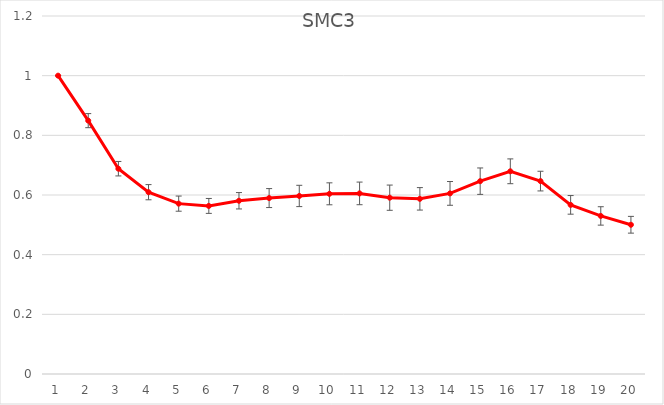
| Category | SMC3 |
|---|---|
| 0 | 1 |
| 1 | 0.849 |
| 2 | 0.688 |
| 3 | 0.609 |
| 4 | 0.571 |
| 5 | 0.563 |
| 6 | 0.581 |
| 7 | 0.59 |
| 8 | 0.597 |
| 9 | 0.604 |
| 10 | 0.605 |
| 11 | 0.591 |
| 12 | 0.587 |
| 13 | 0.605 |
| 14 | 0.646 |
| 15 | 0.679 |
| 16 | 0.647 |
| 17 | 0.567 |
| 18 | 0.53 |
| 19 | 0.5 |